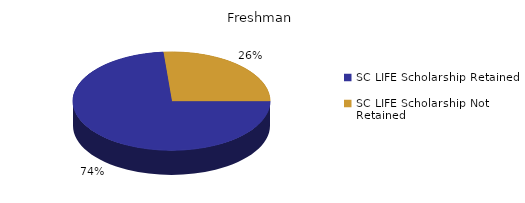
| Category | Freshman |
|---|---|
| SC LIFE Scholarship Retained  | 1658 |
| SC LIFE Scholarship Not Retained  | 594 |